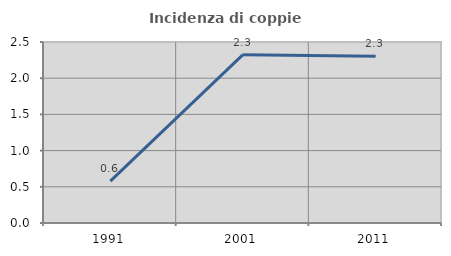
| Category | Incidenza di coppie miste |
|---|---|
| 1991.0 | 0.578 |
| 2001.0 | 2.326 |
| 2011.0 | 2.303 |